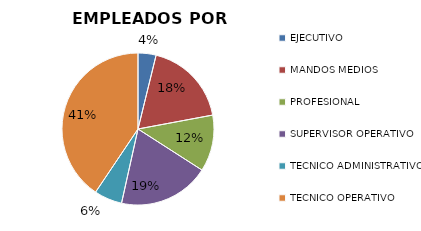
| Category | Series 0 |
|---|---|
| EJECUTIVO | 109 |
| MANDOS MEDIOS | 519 |
| PROFESIONAL | 342 |
| SUPERVISOR OPERATIVO | 552 |
| TECNICO ADMINISTRATIVO | 169 |
| TECNICO OPERATIVO | 1155 |